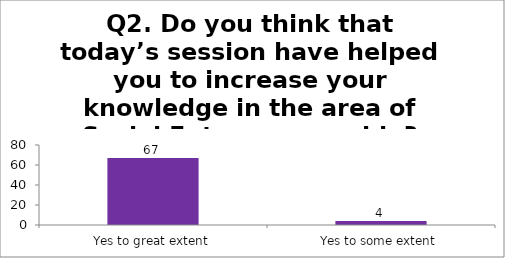
| Category | Q2. Do you think that today’s session have helped you to increase your knowledge in the area of Social Entrepreneurship? |
|---|---|
| Yes to great extent | 67 |
| Yes to some extent | 4 |